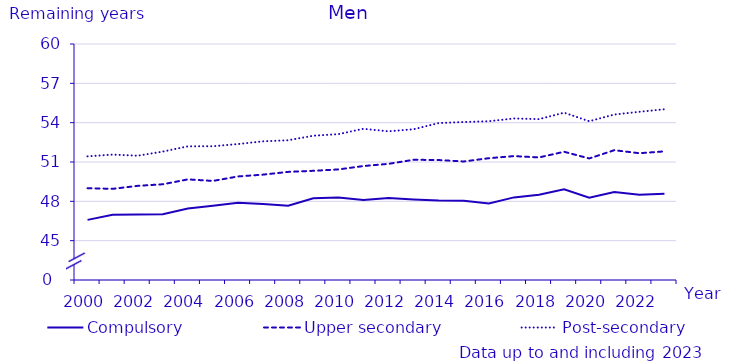
| Category | Compulsory | Upper secondary | Post-secondary |
|---|---|---|---|
| 2000.0 | 46.586 | 49.003 | 51.43 |
| 2001.0 | 46.977 | 48.953 | 51.567 |
| 2002.0 | 46.995 | 49.18 | 51.479 |
| 2003.0 | 47.018 | 49.302 | 51.794 |
| 2004.0 | 47.454 | 49.674 | 52.195 |
| 2005.0 | 47.656 | 49.557 | 52.202 |
| 2006.0 | 47.893 | 49.898 | 52.369 |
| 2007.0 | 47.79 | 50.037 | 52.577 |
| 2008.0 | 47.664 | 50.246 | 52.658 |
| 2009.0 | 48.231 | 50.328 | 53.005 |
| 2010.0 | 48.297 | 50.433 | 53.127 |
| 2011.0 | 48.107 | 50.692 | 53.534 |
| 2012.0 | 48.25 | 50.86 | 53.34 |
| 2013.0 | 48.14 | 51.17 | 53.5 |
| 2014.0 | 48.06 | 51.15 | 53.97 |
| 2015.0 | 48.05 | 51.04 | 54.05 |
| 2016.0 | 47.84 | 51.29 | 54.11 |
| 2017.0 | 48.3 | 51.45 | 54.32 |
| 2018.0 | 48.51 | 51.35 | 54.27 |
| 2019.0 | 48.92 | 51.78 | 54.76 |
| 2020.0 | 48.28 | 51.27 | 54.11 |
| 2021.0 | 48.71 | 51.9 | 54.62 |
| 2022.0 | 48.51 | 51.67 | 54.83 |
| 2023.0 | 48.57 | 51.81 | 55.02 |